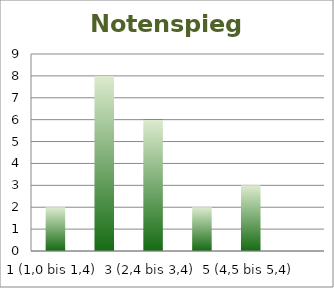
| Category | Series 0 |
|---|---|
| 1 (1,0 bis 1,4) | 2 |
| 2 (1,5 bis 2,4) | 8 |
| 3 (2,4 bis 3,4) | 6 |
| 4 (3,5 bis 4,4) | 2 |
| 5 (4,5 bis 5,4) | 3 |
| 6 (5,5 bis 6,0) | 0 |